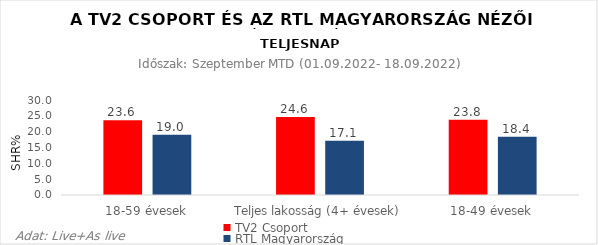
| Category | TV2 Csoport | RTL Magyarország |
|---|---|---|
| 18-59 évesek | 23.6 | 19 |
| Teljes lakosság (4+ évesek) | 24.6 | 17.1 |
| 18-49 évesek | 23.8 | 18.4 |